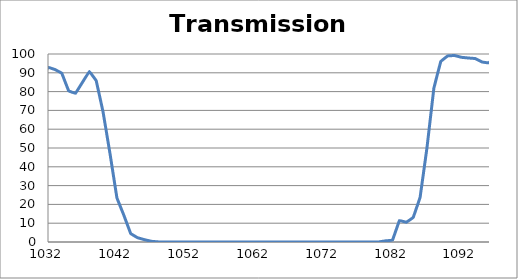
| Category | Transmission (%) |
|---|---|
| 2600.0 | 64.819 |
| 2599.0 | 65.186 |
| 2598.0 | 65.555 |
| 2597.0 | 65.883 |
| 2596.0 | 66.162 |
| 2595.0 | 66.42 |
| 2594.0 | 66.678 |
| 2593.0 | 66.877 |
| 2592.0 | 67.095 |
| 2591.0 | 67.325 |
| 2590.0 | 67.552 |
| 2589.0 | 67.796 |
| 2588.0 | 67.999 |
| 2587.0 | 68.162 |
| 2586.0 | 68.317 |
| 2585.0 | 68.507 |
| 2584.0 | 68.664 |
| 2583.0 | 68.918 |
| 2582.0 | 69.226 |
| 2581.0 | 69.512 |
| 2580.0 | 69.807 |
| 2579.0 | 70.151 |
| 2578.0 | 70.512 |
| 2577.0 | 70.845 |
| 2576.0 | 71.184 |
| 2575.0 | 71.542 |
| 2574.0 | 71.93 |
| 2573.0 | 72.319 |
| 2572.0 | 72.675 |
| 2571.0 | 73.022 |
| 2570.0 | 73.314 |
| 2569.0 | 73.608 |
| 2568.0 | 73.897 |
| 2567.0 | 74.14 |
| 2566.0 | 74.362 |
| 2565.0 | 74.49 |
| 2564.0 | 74.566 |
| 2563.0 | 74.628 |
| 2562.0 | 74.693 |
| 2561.0 | 74.696 |
| 2560.0 | 74.703 |
| 2559.0 | 74.685 |
| 2558.0 | 74.643 |
| 2557.0 | 74.584 |
| 2556.0 | 74.556 |
| 2555.0 | 74.48 |
| 2554.0 | 74.427 |
| 2553.0 | 74.418 |
| 2552.0 | 74.424 |
| 2551.0 | 74.475 |
| 2550.0 | 74.578 |
| 2549.0 | 74.709 |
| 2548.0 | 74.891 |
| 2547.0 | 75.08 |
| 2546.0 | 75.272 |
| 2545.0 | 75.492 |
| 2544.0 | 75.713 |
| 2543.0 | 75.906 |
| 2542.0 | 76.072 |
| 2541.0 | 76.221 |
| 2540.0 | 76.339 |
| 2539.0 | 76.352 |
| 2538.0 | 76.293 |
| 2537.0 | 76.152 |
| 2536.0 | 76.034 |
| 2535.0 | 75.842 |
| 2534.0 | 75.558 |
| 2533.0 | 75.249 |
| 2532.0 | 74.847 |
| 2531.0 | 74.474 |
| 2530.0 | 73.999 |
| 2529.0 | 73.49 |
| 2528.0 | 73.081 |
| 2527.0 | 72.629 |
| 2526.0 | 72.203 |
| 2525.0 | 71.814 |
| 2524.0 | 71.435 |
| 2523.0 | 71.111 |
| 2522.0 | 70.844 |
| 2521.0 | 70.589 |
| 2520.0 | 70.412 |
| 2519.0 | 70.319 |
| 2518.0 | 70.301 |
| 2517.0 | 70.356 |
| 2516.0 | 70.497 |
| 2515.0 | 70.667 |
| 2514.0 | 70.884 |
| 2513.0 | 71.127 |
| 2512.0 | 71.414 |
| 2511.0 | 71.707 |
| 2510.0 | 72.014 |
| 2509.0 | 72.284 |
| 2508.0 | 72.513 |
| 2507.0 | 72.692 |
| 2506.0 | 72.827 |
| 2505.0 | 72.874 |
| 2504.0 | 72.84 |
| 2503.0 | 72.759 |
| 2502.0 | 72.569 |
| 2501.0 | 72.298 |
| 2500.0 | 71.968 |
| 2499.0 | 71.635 |
| 2498.0 | 71.267 |
| 2497.0 | 70.84 |
| 2496.0 | 70.388 |
| 2495.0 | 69.922 |
| 2494.0 | 69.465 |
| 2493.0 | 69.022 |
| 2492.0 | 68.689 |
| 2491.0 | 68.455 |
| 2490.0 | 68.243 |
| 2489.0 | 68.086 |
| 2488.0 | 68.006 |
| 2487.0 | 68.022 |
| 2486.0 | 68.131 |
| 2485.0 | 68.337 |
| 2484.0 | 68.64 |
| 2483.0 | 69.028 |
| 2482.0 | 69.51 |
| 2481.0 | 70.027 |
| 2480.0 | 70.605 |
| 2479.0 | 71.265 |
| 2478.0 | 71.965 |
| 2477.0 | 72.663 |
| 2476.0 | 73.4 |
| 2475.0 | 74.11 |
| 2474.0 | 74.782 |
| 2473.0 | 75.445 |
| 2472.0 | 76.085 |
| 2471.0 | 76.671 |
| 2470.0 | 77.203 |
| 2469.0 | 77.634 |
| 2468.0 | 78 |
| 2467.0 | 78.272 |
| 2466.0 | 78.493 |
| 2465.0 | 78.647 |
| 2464.0 | 78.76 |
| 2463.0 | 78.844 |
| 2462.0 | 78.886 |
| 2461.0 | 78.891 |
| 2460.0 | 78.882 |
| 2459.0 | 78.859 |
| 2458.0 | 78.831 |
| 2457.0 | 78.801 |
| 2456.0 | 78.793 |
| 2455.0 | 78.766 |
| 2454.0 | 78.74 |
| 2453.0 | 78.744 |
| 2452.0 | 78.744 |
| 2451.0 | 78.732 |
| 2450.0 | 78.716 |
| 2449.0 | 78.675 |
| 2448.0 | 78.624 |
| 2447.0 | 78.556 |
| 2446.0 | 78.48 |
| 2445.0 | 78.41 |
| 2444.0 | 78.32 |
| 2443.0 | 78.2 |
| 2442.0 | 78.053 |
| 2441.0 | 77.915 |
| 2440.0 | 77.762 |
| 2439.0 | 77.594 |
| 2438.0 | 77.428 |
| 2437.0 | 77.289 |
| 2436.0 | 77.171 |
| 2435.0 | 77.075 |
| 2434.0 | 77.006 |
| 2433.0 | 76.975 |
| 2432.0 | 76.984 |
| 2431.0 | 77.02 |
| 2430.0 | 77.064 |
| 2429.0 | 77.133 |
| 2428.0 | 77.218 |
| 2427.0 | 77.297 |
| 2426.0 | 77.363 |
| 2425.0 | 77.401 |
| 2424.0 | 77.411 |
| 2423.0 | 77.366 |
| 2422.0 | 77.258 |
| 2421.0 | 77.071 |
| 2420.0 | 76.832 |
| 2419.0 | 76.56 |
| 2418.0 | 76.213 |
| 2417.0 | 75.783 |
| 2416.0 | 75.285 |
| 2415.0 | 74.745 |
| 2414.0 | 74.163 |
| 2413.0 | 73.575 |
| 2412.0 | 72.996 |
| 2411.0 | 72.394 |
| 2410.0 | 71.804 |
| 2409.0 | 71.261 |
| 2408.0 | 70.718 |
| 2407.0 | 70.236 |
| 2406.0 | 69.838 |
| 2405.0 | 69.51 |
| 2404.0 | 69.263 |
| 2403.0 | 69.066 |
| 2402.0 | 68.926 |
| 2401.0 | 68.846 |
| 2400.0 | 68.843 |
| 2399.0 | 68.908 |
| 2398.0 | 69.013 |
| 2397.0 | 69.109 |
| 2396.0 | 69.181 |
| 2395.0 | 69.226 |
| 2394.0 | 69.222 |
| 2393.0 | 69.159 |
| 2392.0 | 69.048 |
| 2391.0 | 68.865 |
| 2390.0 | 68.61 |
| 2389.0 | 68.271 |
| 2388.0 | 67.83 |
| 2387.0 | 67.295 |
| 2386.0 | 66.698 |
| 2385.0 | 66.06 |
| 2384.0 | 65.41 |
| 2383.0 | 64.742 |
| 2382.0 | 64.098 |
| 2381.0 | 63.474 |
| 2380.0 | 62.869 |
| 2379.0 | 62.323 |
| 2378.0 | 61.845 |
| 2377.0 | 61.447 |
| 2376.0 | 61.135 |
| 2375.0 | 60.935 |
| 2374.0 | 60.836 |
| 2373.0 | 60.809 |
| 2372.0 | 60.877 |
| 2371.0 | 61.003 |
| 2370.0 | 61.18 |
| 2369.0 | 61.409 |
| 2368.0 | 61.676 |
| 2367.0 | 61.979 |
| 2366.0 | 62.3 |
| 2365.0 | 62.607 |
| 2364.0 | 62.866 |
| 2363.0 | 63.094 |
| 2362.0 | 63.284 |
| 2361.0 | 63.412 |
| 2360.0 | 63.46 |
| 2359.0 | 63.458 |
| 2358.0 | 63.441 |
| 2357.0 | 63.353 |
| 2356.0 | 63.185 |
| 2355.0 | 63.002 |
| 2354.0 | 62.808 |
| 2353.0 | 62.629 |
| 2352.0 | 62.469 |
| 2351.0 | 62.379 |
| 2350.0 | 62.343 |
| 2349.0 | 62.348 |
| 2348.0 | 62.431 |
| 2347.0 | 62.603 |
| 2346.0 | 62.853 |
| 2345.0 | 63.189 |
| 2344.0 | 63.595 |
| 2343.0 | 64.076 |
| 2342.0 | 64.563 |
| 2341.0 | 65.063 |
| 2340.0 | 65.568 |
| 2339.0 | 66.084 |
| 2338.0 | 66.57 |
| 2337.0 | 66.985 |
| 2336.0 | 67.332 |
| 2335.0 | 67.628 |
| 2334.0 | 67.853 |
| 2333.0 | 67.961 |
| 2332.0 | 68.007 |
| 2331.0 | 67.968 |
| 2330.0 | 67.865 |
| 2329.0 | 67.721 |
| 2328.0 | 67.581 |
| 2327.0 | 67.446 |
| 2326.0 | 67.298 |
| 2325.0 | 67.173 |
| 2324.0 | 67.088 |
| 2323.0 | 67.092 |
| 2322.0 | 67.159 |
| 2321.0 | 67.3 |
| 2320.0 | 67.536 |
| 2319.0 | 67.848 |
| 2318.0 | 68.179 |
| 2317.0 | 68.553 |
| 2316.0 | 68.92 |
| 2315.0 | 69.244 |
| 2314.0 | 69.511 |
| 2313.0 | 69.662 |
| 2312.0 | 69.697 |
| 2311.0 | 69.585 |
| 2310.0 | 69.311 |
| 2309.0 | 68.827 |
| 2308.0 | 68.141 |
| 2307.0 | 67.315 |
| 2306.0 | 66.362 |
| 2305.0 | 65.279 |
| 2304.0 | 64.202 |
| 2303.0 | 63.066 |
| 2302.0 | 61.9 |
| 2301.0 | 60.809 |
| 2300.0 | 59.82 |
| 2299.0 | 58.946 |
| 2298.0 | 58.244 |
| 2297.0 | 57.702 |
| 2296.0 | 57.354 |
| 2295.0 | 57.173 |
| 2294.0 | 57.153 |
| 2293.0 | 57.285 |
| 2292.0 | 57.59 |
| 2291.0 | 58.022 |
| 2290.0 | 58.569 |
| 2289.0 | 59.193 |
| 2288.0 | 59.879 |
| 2287.0 | 60.48 |
| 2286.0 | 60.995 |
| 2285.0 | 61.429 |
| 2284.0 | 61.678 |
| 2283.0 | 61.697 |
| 2282.0 | 61.487 |
| 2281.0 | 61.019 |
| 2280.0 | 60.273 |
| 2279.0 | 59.287 |
| 2278.0 | 58.157 |
| 2277.0 | 56.857 |
| 2276.0 | 55.406 |
| 2275.0 | 53.91 |
| 2274.0 | 52.397 |
| 2273.0 | 50.979 |
| 2272.0 | 49.644 |
| 2271.0 | 48.457 |
| 2270.0 | 47.463 |
| 2269.0 | 46.634 |
| 2268.0 | 45.977 |
| 2267.0 | 45.558 |
| 2266.0 | 45.298 |
| 2265.0 | 45.23 |
| 2264.0 | 45.32 |
| 2263.0 | 45.573 |
| 2262.0 | 45.948 |
| 2261.0 | 46.405 |
| 2260.0 | 46.931 |
| 2259.0 | 47.506 |
| 2258.0 | 48.061 |
| 2257.0 | 48.597 |
| 2256.0 | 49.051 |
| 2255.0 | 49.42 |
| 2254.0 | 49.707 |
| 2253.0 | 49.852 |
| 2252.0 | 49.83 |
| 2251.0 | 49.704 |
| 2250.0 | 49.469 |
| 2249.0 | 49.146 |
| 2248.0 | 48.754 |
| 2247.0 | 48.34 |
| 2246.0 | 47.924 |
| 2245.0 | 47.582 |
| 2244.0 | 47.323 |
| 2243.0 | 47.099 |
| 2242.0 | 46.997 |
| 2241.0 | 47.035 |
| 2240.0 | 47.222 |
| 2239.0 | 47.569 |
| 2238.0 | 48.023 |
| 2237.0 | 48.679 |
| 2236.0 | 49.476 |
| 2235.0 | 50.312 |
| 2234.0 | 51.22 |
| 2233.0 | 52.176 |
| 2232.0 | 53.073 |
| 2231.0 | 54.026 |
| 2230.0 | 54.828 |
| 2229.0 | 55.519 |
| 2228.0 | 56.086 |
| 2227.0 | 56.477 |
| 2226.0 | 56.724 |
| 2225.0 | 56.844 |
| 2224.0 | 56.798 |
| 2223.0 | 56.605 |
| 2222.0 | 56.346 |
| 2221.0 | 56.024 |
| 2220.0 | 55.695 |
| 2219.0 | 55.371 |
| 2218.0 | 55.112 |
| 2217.0 | 54.858 |
| 2216.0 | 54.754 |
| 2215.0 | 54.658 |
| 2214.0 | 54.632 |
| 2213.0 | 54.667 |
| 2212.0 | 54.758 |
| 2211.0 | 54.882 |
| 2210.0 | 55.009 |
| 2209.0 | 55.094 |
| 2208.0 | 55.105 |
| 2207.0 | 55.017 |
| 2206.0 | 54.839 |
| 2205.0 | 54.577 |
| 2204.0 | 54.155 |
| 2203.0 | 53.618 |
| 2202.0 | 53.015 |
| 2201.0 | 52.262 |
| 2200.0 | 51.461 |
| 2199.0 | 50.591 |
| 2198.0 | 49.739 |
| 2197.0 | 48.84 |
| 2196.0 | 48.033 |
| 2195.0 | 47.205 |
| 2194.0 | 46.493 |
| 2193.0 | 45.817 |
| 2192.0 | 45.204 |
| 2191.0 | 44.623 |
| 2190.0 | 44.103 |
| 2189.0 | 43.623 |
| 2188.0 | 43.174 |
| 2187.0 | 42.755 |
| 2186.0 | 42.382 |
| 2185.0 | 42.061 |
| 2184.0 | 41.732 |
| 2183.0 | 41.391 |
| 2182.0 | 41.083 |
| 2181.0 | 40.806 |
| 2180.0 | 40.563 |
| 2179.0 | 40.363 |
| 2178.0 | 40.196 |
| 2177.0 | 40.067 |
| 2176.0 | 40.04 |
| 2175.0 | 40.05 |
| 2174.0 | 40.118 |
| 2173.0 | 40.238 |
| 2172.0 | 40.445 |
| 2171.0 | 40.729 |
| 2170.0 | 41.052 |
| 2169.0 | 41.364 |
| 2168.0 | 41.678 |
| 2167.0 | 41.944 |
| 2166.0 | 42.181 |
| 2165.0 | 42.373 |
| 2164.0 | 42.398 |
| 2163.0 | 42.271 |
| 2162.0 | 41.985 |
| 2161.0 | 41.537 |
| 2160.0 | 40.943 |
| 2159.0 | 40.245 |
| 2158.0 | 39.477 |
| 2157.0 | 38.59 |
| 2156.0 | 37.696 |
| 2155.0 | 36.844 |
| 2154.0 | 36.078 |
| 2153.0 | 35.374 |
| 2152.0 | 34.837 |
| 2151.0 | 34.429 |
| 2150.0 | 34.226 |
| 2149.0 | 34.2 |
| 2148.0 | 34.363 |
| 2147.0 | 34.743 |
| 2146.0 | 35.36 |
| 2145.0 | 36.143 |
| 2144.0 | 37.094 |
| 2143.0 | 38.211 |
| 2142.0 | 39.443 |
| 2141.0 | 40.74 |
| 2140.0 | 42.123 |
| 2139.0 | 43.321 |
| 2138.0 | 44.391 |
| 2137.0 | 45.266 |
| 2136.0 | 45.914 |
| 2135.0 | 46.28 |
| 2134.0 | 46.306 |
| 2133.0 | 46.081 |
| 2132.0 | 45.608 |
| 2131.0 | 44.975 |
| 2130.0 | 44.256 |
| 2129.0 | 43.469 |
| 2128.0 | 42.725 |
| 2127.0 | 42.079 |
| 2126.0 | 41.594 |
| 2125.0 | 41.308 |
| 2124.0 | 41.211 |
| 2123.0 | 41.386 |
| 2122.0 | 41.839 |
| 2121.0 | 42.53 |
| 2120.0 | 43.474 |
| 2119.0 | 44.659 |
| 2118.0 | 46.052 |
| 2117.0 | 47.633 |
| 2116.0 | 49.203 |
| 2115.0 | 50.813 |
| 2114.0 | 52.321 |
| 2113.0 | 53.642 |
| 2112.0 | 54.704 |
| 2111.0 | 55.366 |
| 2110.0 | 55.663 |
| 2109.0 | 55.633 |
| 2108.0 | 55.317 |
| 2107.0 | 54.817 |
| 2106.0 | 54.199 |
| 2105.0 | 53.516 |
| 2104.0 | 52.905 |
| 2103.0 | 52.424 |
| 2102.0 | 52.135 |
| 2101.0 | 52.025 |
| 2100.0 | 52.146 |
| 2099.0 | 52.506 |
| 2098.0 | 53.049 |
| 2097.0 | 53.71 |
| 2096.0 | 54.446 |
| 2095.0 | 55.178 |
| 2094.0 | 55.862 |
| 2093.0 | 56.403 |
| 2092.0 | 56.687 |
| 2091.0 | 56.698 |
| 2090.0 | 56.391 |
| 2089.0 | 55.823 |
| 2088.0 | 54.984 |
| 2087.0 | 53.927 |
| 2086.0 | 52.704 |
| 2085.0 | 51.425 |
| 2084.0 | 50.184 |
| 2083.0 | 49.05 |
| 2082.0 | 48.121 |
| 2081.0 | 47.385 |
| 2080.0 | 46.882 |
| 2079.0 | 46.67 |
| 2078.0 | 46.727 |
| 2077.0 | 46.991 |
| 2076.0 | 47.467 |
| 2075.0 | 48.101 |
| 2074.0 | 48.814 |
| 2073.0 | 49.532 |
| 2072.0 | 50.151 |
| 2071.0 | 50.529 |
| 2070.0 | 50.618 |
| 2069.0 | 50.373 |
| 2068.0 | 49.785 |
| 2067.0 | 48.915 |
| 2066.0 | 47.788 |
| 2065.0 | 46.452 |
| 2064.0 | 45.064 |
| 2063.0 | 43.687 |
| 2062.0 | 42.407 |
| 2061.0 | 41.323 |
| 2060.0 | 40.404 |
| 2059.0 | 39.714 |
| 2058.0 | 39.309 |
| 2057.0 | 39.164 |
| 2056.0 | 39.233 |
| 2055.0 | 39.529 |
| 2054.0 | 40.042 |
| 2053.0 | 40.74 |
| 2052.0 | 41.546 |
| 2051.0 | 42.396 |
| 2050.0 | 43.26 |
| 2049.0 | 44.075 |
| 2048.0 | 44.756 |
| 2047.0 | 45.183 |
| 2046.0 | 45.373 |
| 2045.0 | 45.317 |
| 2044.0 | 45.044 |
| 2043.0 | 44.602 |
| 2042.0 | 44.056 |
| 2041.0 | 43.457 |
| 2040.0 | 42.877 |
| 2039.0 | 42.407 |
| 2038.0 | 42.134 |
| 2037.0 | 42.07 |
| 2036.0 | 42.229 |
| 2035.0 | 42.654 |
| 2034.0 | 43.407 |
| 2033.0 | 44.365 |
| 2032.0 | 45.485 |
| 2031.0 | 46.776 |
| 2030.0 | 48.163 |
| 2029.0 | 49.521 |
| 2028.0 | 50.666 |
| 2027.0 | 51.564 |
| 2026.0 | 52.142 |
| 2025.0 | 52.378 |
| 2024.0 | 52.232 |
| 2023.0 | 51.72 |
| 2022.0 | 50.959 |
| 2021.0 | 50.064 |
| 2020.0 | 49.136 |
| 2019.0 | 48.27 |
| 2018.0 | 47.51 |
| 2017.0 | 46.925 |
| 2016.0 | 46.591 |
| 2015.0 | 46.493 |
| 2014.0 | 46.585 |
| 2013.0 | 46.872 |
| 2012.0 | 47.363 |
| 2011.0 | 47.936 |
| 2010.0 | 48.498 |
| 2009.0 | 49.026 |
| 2008.0 | 49.409 |
| 2007.0 | 49.563 |
| 2006.0 | 49.472 |
| 2005.0 | 49.11 |
| 2004.0 | 48.437 |
| 2003.0 | 47.496 |
| 2002.0 | 46.39 |
| 2001.0 | 45.203 |
| 2000.0 | 44.028 |
| 1999.0 | 42.994 |
| 1998.0 | 42.089 |
| 1997.0 | 41.349 |
| 1996.0 | 40.872 |
| 1995.0 | 40.657 |
| 1994.0 | 40.677 |
| 1993.0 | 40.871 |
| 1992.0 | 41.212 |
| 1991.0 | 41.647 |
| 1990.0 | 42.101 |
| 1989.0 | 42.507 |
| 1988.0 | 42.748 |
| 1987.0 | 42.785 |
| 1986.0 | 42.569 |
| 1985.0 | 42.089 |
| 1984.0 | 41.373 |
| 1983.0 | 40.477 |
| 1982.0 | 39.48 |
| 1981.0 | 38.451 |
| 1980.0 | 37.474 |
| 1979.0 | 36.602 |
| 1978.0 | 35.887 |
| 1977.0 | 35.356 |
| 1976.0 | 35.031 |
| 1975.0 | 34.907 |
| 1974.0 | 34.984 |
| 1973.0 | 35.251 |
| 1972.0 | 35.692 |
| 1971.0 | 36.23 |
| 1970.0 | 36.853 |
| 1969.0 | 37.543 |
| 1968.0 | 38.186 |
| 1967.0 | 38.691 |
| 1966.0 | 39.081 |
| 1965.0 | 39.305 |
| 1964.0 | 39.312 |
| 1963.0 | 39.128 |
| 1962.0 | 38.839 |
| 1961.0 | 38.483 |
| 1960.0 | 38.096 |
| 1959.0 | 37.761 |
| 1958.0 | 37.494 |
| 1957.0 | 37.352 |
| 1956.0 | 37.388 |
| 1955.0 | 37.641 |
| 1954.0 | 38.116 |
| 1953.0 | 38.765 |
| 1952.0 | 39.555 |
| 1951.0 | 40.463 |
| 1950.0 | 41.405 |
| 1949.0 | 42.395 |
| 1948.0 | 43.29 |
| 1947.0 | 44.03 |
| 1946.0 | 44.625 |
| 1945.0 | 45.104 |
| 1944.0 | 45.387 |
| 1943.0 | 45.541 |
| 1942.0 | 45.632 |
| 1941.0 | 45.685 |
| 1940.0 | 45.746 |
| 1939.0 | 45.855 |
| 1938.0 | 46.1 |
| 1937.0 | 46.467 |
| 1936.0 | 46.965 |
| 1935.0 | 47.565 |
| 1934.0 | 48.212 |
| 1933.0 | 48.843 |
| 1932.0 | 49.426 |
| 1931.0 | 49.893 |
| 1930.0 | 50.146 |
| 1929.0 | 50.15 |
| 1928.0 | 50.006 |
| 1927.0 | 49.693 |
| 1926.0 | 49.246 |
| 1925.0 | 48.76 |
| 1924.0 | 48.316 |
| 1923.0 | 47.929 |
| 1922.0 | 47.622 |
| 1921.0 | 47.496 |
| 1920.0 | 47.574 |
| 1919.0 | 47.83 |
| 1918.0 | 48.297 |
| 1917.0 | 48.886 |
| 1916.0 | 49.488 |
| 1915.0 | 49.95 |
| 1914.0 | 50.134 |
| 1913.0 | 49.932 |
| 1912.0 | 49.351 |
| 1911.0 | 48.535 |
| 1910.0 | 47.563 |
| 1909.0 | 46.385 |
| 1908.0 | 44.963 |
| 1907.0 | 43.269 |
| 1906.0 | 41.473 |
| 1905.0 | 40.005 |
| 1904.0 | 38.984 |
| 1903.0 | 38.363 |
| 1902.0 | 38.103 |
| 1901.0 | 38.058 |
| 1900.0 | 38.253 |
| 1899.0 | 38.566 |
| 1898.0 | 38.936 |
| 1897.0 | 39.393 |
| 1896.0 | 39.751 |
| 1895.0 | 39.902 |
| 1894.0 | 39.718 |
| 1893.0 | 39.113 |
| 1892.0 | 37.954 |
| 1891.0 | 36.584 |
| 1890.0 | 35.138 |
| 1889.0 | 33.636 |
| 1888.0 | 32.341 |
| 1887.0 | 31.189 |
| 1886.0 | 30.175 |
| 1885.0 | 29.281 |
| 1884.0 | 28.68 |
| 1883.0 | 28.493 |
| 1882.0 | 28.692 |
| 1881.0 | 29.311 |
| 1880.0 | 30.289 |
| 1879.0 | 31.529 |
| 1878.0 | 33.203 |
| 1877.0 | 34.893 |
| 1876.0 | 36.587 |
| 1875.0 | 38.166 |
| 1874.0 | 39.424 |
| 1873.0 | 40.089 |
| 1872.0 | 40.334 |
| 1871.0 | 40.049 |
| 1870.0 | 39.191 |
| 1869.0 | 38.099 |
| 1868.0 | 36.932 |
| 1867.0 | 35.939 |
| 1866.0 | 35.167 |
| 1865.0 | 34.691 |
| 1864.0 | 34.477 |
| 1863.0 | 34.582 |
| 1862.0 | 35.106 |
| 1861.0 | 35.957 |
| 1860.0 | 37.185 |
| 1859.0 | 38.779 |
| 1858.0 | 40.508 |
| 1857.0 | 42.438 |
| 1856.0 | 44.419 |
| 1855.0 | 46.245 |
| 1854.0 | 47.848 |
| 1853.0 | 48.962 |
| 1852.0 | 49.752 |
| 1851.0 | 50.12 |
| 1850.0 | 50.13 |
| 1849.0 | 49.779 |
| 1848.0 | 49.006 |
| 1847.0 | 48.173 |
| 1846.0 | 47.657 |
| 1845.0 | 47.439 |
| 1844.0 | 47.491 |
| 1843.0 | 47.726 |
| 1842.0 | 48.037 |
| 1841.0 | 48.227 |
| 1840.0 | 48.658 |
| 1839.0 | 49.287 |
| 1838.0 | 50.05 |
| 1837.0 | 50.916 |
| 1836.0 | 51.724 |
| 1835.0 | 52.469 |
| 1834.0 | 53.185 |
| 1833.0 | 53.835 |
| 1832.0 | 54.443 |
| 1831.0 | 54.73 |
| 1830.0 | 54.792 |
| 1829.0 | 54.52 |
| 1828.0 | 53.93 |
| 1827.0 | 52.884 |
| 1826.0 | 51.468 |
| 1825.0 | 50.067 |
| 1824.0 | 48.608 |
| 1823.0 | 47.092 |
| 1822.0 | 45.327 |
| 1821.0 | 43.524 |
| 1820.0 | 42.103 |
| 1819.0 | 41.336 |
| 1818.0 | 41.1 |
| 1817.0 | 41.306 |
| 1816.0 | 41.89 |
| 1815.0 | 42.831 |
| 1814.0 | 44.053 |
| 1813.0 | 45.535 |
| 1812.0 | 47.145 |
| 1811.0 | 48.531 |
| 1810.0 | 49.499 |
| 1809.0 | 49.767 |
| 1808.0 | 49.209 |
| 1807.0 | 47.814 |
| 1806.0 | 45.675 |
| 1805.0 | 43.204 |
| 1804.0 | 40.66 |
| 1803.0 | 38.307 |
| 1802.0 | 36.269 |
| 1801.0 | 34.816 |
| 1800.0 | 33.836 |
| 1799.0 | 33.52 |
| 1798.0 | 33.877 |
| 1797.0 | 34.934 |
| 1796.0 | 36.567 |
| 1795.0 | 38.819 |
| 1794.0 | 41.548 |
| 1793.0 | 44.456 |
| 1792.0 | 47.331 |
| 1791.0 | 49.507 |
| 1790.0 | 50.735 |
| 1789.0 | 50.776 |
| 1788.0 | 49.69 |
| 1787.0 | 47.856 |
| 1786.0 | 45.599 |
| 1785.0 | 43.425 |
| 1784.0 | 41.451 |
| 1783.0 | 40.26 |
| 1782.0 | 39.671 |
| 1781.0 | 39.803 |
| 1780.0 | 40.695 |
| 1779.0 | 42.294 |
| 1778.0 | 44.582 |
| 1777.0 | 47.245 |
| 1776.0 | 50.251 |
| 1775.0 | 53.277 |
| 1774.0 | 55.905 |
| 1773.0 | 57.732 |
| 1772.0 | 58.665 |
| 1771.0 | 58.635 |
| 1770.0 | 57.812 |
| 1769.0 | 56.5 |
| 1768.0 | 55.094 |
| 1767.0 | 53.926 |
| 1766.0 | 53.19 |
| 1765.0 | 53.126 |
| 1764.0 | 53.752 |
| 1763.0 | 55.022 |
| 1762.0 | 56.646 |
| 1761.0 | 58.359 |
| 1760.0 | 59.76 |
| 1759.0 | 60.243 |
| 1758.0 | 59.661 |
| 1757.0 | 57.939 |
| 1756.0 | 55.247 |
| 1755.0 | 51.901 |
| 1754.0 | 48.527 |
| 1753.0 | 45.48 |
| 1752.0 | 42.989 |
| 1751.0 | 41.334 |
| 1750.0 | 40.457 |
| 1749.0 | 40.456 |
| 1748.0 | 41.299 |
| 1747.0 | 42.898 |
| 1746.0 | 45.196 |
| 1745.0 | 47.865 |
| 1744.0 | 50.707 |
| 1743.0 | 53.093 |
| 1742.0 | 54.603 |
| 1741.0 | 54.92 |
| 1740.0 | 53.906 |
| 1739.0 | 51.846 |
| 1738.0 | 49.146 |
| 1737.0 | 46.256 |
| 1736.0 | 43.597 |
| 1735.0 | 41.374 |
| 1734.0 | 39.776 |
| 1733.0 | 38.879 |
| 1732.0 | 38.735 |
| 1731.0 | 39.246 |
| 1730.0 | 40.45 |
| 1729.0 | 42.324 |
| 1728.0 | 44.744 |
| 1727.0 | 47.553 |
| 1726.0 | 50.552 |
| 1725.0 | 53.349 |
| 1724.0 | 55.795 |
| 1723.0 | 57.589 |
| 1722.0 | 58.642 |
| 1721.0 | 58.979 |
| 1720.0 | 58.822 |
| 1719.0 | 58.416 |
| 1718.0 | 58.012 |
| 1717.0 | 57.847 |
| 1716.0 | 58.057 |
| 1715.0 | 58.675 |
| 1714.0 | 59.641 |
| 1713.0 | 60.842 |
| 1712.0 | 62.212 |
| 1711.0 | 63.533 |
| 1710.0 | 64.732 |
| 1709.0 | 65.697 |
| 1708.0 | 66.364 |
| 1707.0 | 66.787 |
| 1706.0 | 67.034 |
| 1705.0 | 67.19 |
| 1704.0 | 67.288 |
| 1703.0 | 67.363 |
| 1702.0 | 67.352 |
| 1701.0 | 67.157 |
| 1700.0 | 66.676 |
| 1699.0 | 65.815 |
| 1698.0 | 64.532 |
| 1697.0 | 62.904 |
| 1696.0 | 61.011 |
| 1695.0 | 58.979 |
| 1694.0 | 57.02 |
| 1693.0 | 55.325 |
| 1692.0 | 54.104 |
| 1691.0 | 53.361 |
| 1690.0 | 53.21 |
| 1689.0 | 53.714 |
| 1688.0 | 54.869 |
| 1687.0 | 56.601 |
| 1686.0 | 58.764 |
| 1685.0 | 61.079 |
| 1684.0 | 63.252 |
| 1683.0 | 64.904 |
| 1682.0 | 65.752 |
| 1681.0 | 65.622 |
| 1680.0 | 64.488 |
| 1679.0 | 62.658 |
| 1678.0 | 60.437 |
| 1677.0 | 58.258 |
| 1676.0 | 56.422 |
| 1675.0 | 55.172 |
| 1674.0 | 54.641 |
| 1673.0 | 54.87 |
| 1672.0 | 55.824 |
| 1671.0 | 57.416 |
| 1670.0 | 59.56 |
| 1669.0 | 62.096 |
| 1668.0 | 64.651 |
| 1667.0 | 66.86 |
| 1666.0 | 68.645 |
| 1665.0 | 69.772 |
| 1664.0 | 70.255 |
| 1663.0 | 70.161 |
| 1662.0 | 69.71 |
| 1661.0 | 69.127 |
| 1660.0 | 68.588 |
| 1659.0 | 68.248 |
| 1658.0 | 68.18 |
| 1657.0 | 68.39 |
| 1656.0 | 68.867 |
| 1655.0 | 69.523 |
| 1654.0 | 70.218 |
| 1653.0 | 70.873 |
| 1652.0 | 71.442 |
| 1651.0 | 71.888 |
| 1650.0 | 72.17 |
| 1649.0 | 72.362 |
| 1648.0 | 72.523 |
| 1647.0 | 72.725 |
| 1646.0 | 72.997 |
| 1645.0 | 73.36 |
| 1644.0 | 73.81 |
| 1643.0 | 74.271 |
| 1642.0 | 74.674 |
| 1641.0 | 74.962 |
| 1640.0 | 75.057 |
| 1639.0 | 74.88 |
| 1638.0 | 74.434 |
| 1637.0 | 73.805 |
| 1636.0 | 73.121 |
| 1635.0 | 72.515 |
| 1634.0 | 72.112 |
| 1633.0 | 72.02 |
| 1632.0 | 72.267 |
| 1631.0 | 72.853 |
| 1630.0 | 73.747 |
| 1629.0 | 74.815 |
| 1628.0 | 75.915 |
| 1627.0 | 76.918 |
| 1626.0 | 77.627 |
| 1625.0 | 77.912 |
| 1624.0 | 77.773 |
| 1623.0 | 77.265 |
| 1622.0 | 76.468 |
| 1621.0 | 75.543 |
| 1620.0 | 74.665 |
| 1619.0 | 73.977 |
| 1618.0 | 73.602 |
| 1617.0 | 73.599 |
| 1616.0 | 73.97 |
| 1615.0 | 74.662 |
| 1614.0 | 75.574 |
| 1613.0 | 76.589 |
| 1612.0 | 77.545 |
| 1611.0 | 78.298 |
| 1610.0 | 78.752 |
| 1609.0 | 78.855 |
| 1608.0 | 78.589 |
| 1607.0 | 78.027 |
| 1606.0 | 77.361 |
| 1605.0 | 76.695 |
| 1604.0 | 76.161 |
| 1603.0 | 75.916 |
| 1602.0 | 75.999 |
| 1601.0 | 76.451 |
| 1600.0 | 77.177 |
| 1599.0 | 78.073 |
| 1598.0 | 78.974 |
| 1597.0 | 79.727 |
| 1596.0 | 80.215 |
| 1595.0 | 80.323 |
| 1594.0 | 80.089 |
| 1593.0 | 79.573 |
| 1592.0 | 78.95 |
| 1591.0 | 78.376 |
| 1590.0 | 78.014 |
| 1589.0 | 77.972 |
| 1588.0 | 78.274 |
| 1587.0 | 78.939 |
| 1586.0 | 79.829 |
| 1585.0 | 80.782 |
| 1584.0 | 81.675 |
| 1583.0 | 82.287 |
| 1582.0 | 82.594 |
| 1581.0 | 82.583 |
| 1580.0 | 82.3 |
| 1579.0 | 81.902 |
| 1578.0 | 81.494 |
| 1577.0 | 81.255 |
| 1576.0 | 81.306 |
| 1575.0 | 81.687 |
| 1574.0 | 82.337 |
| 1573.0 | 83.197 |
| 1572.0 | 84.076 |
| 1571.0 | 84.856 |
| 1570.0 | 85.384 |
| 1569.0 | 85.563 |
| 1568.0 | 85.403 |
| 1567.0 | 84.995 |
| 1566.0 | 84.463 |
| 1565.0 | 84.035 |
| 1564.0 | 83.842 |
| 1563.0 | 83.974 |
| 1562.0 | 84.493 |
| 1561.0 | 85.326 |
| 1560.0 | 86.297 |
| 1559.0 | 87.243 |
| 1558.0 | 87.917 |
| 1557.0 | 88.105 |
| 1556.0 | 87.859 |
| 1555.0 | 87.193 |
| 1554.0 | 86.351 |
| 1553.0 | 85.519 |
| 1552.0 | 84.967 |
| 1551.0 | 84.863 |
| 1550.0 | 85.262 |
| 1549.0 | 86.073 |
| 1548.0 | 87.131 |
| 1547.0 | 88.255 |
| 1546.0 | 89.178 |
| 1545.0 | 89.721 |
| 1544.0 | 89.777 |
| 1543.0 | 89.376 |
| 1542.0 | 88.686 |
| 1541.0 | 87.928 |
| 1540.0 | 87.356 |
| 1539.0 | 87.139 |
| 1538.0 | 87.33 |
| 1537.0 | 87.944 |
| 1536.0 | 88.812 |
| 1535.0 | 89.808 |
| 1534.0 | 90.693 |
| 1533.0 | 91.316 |
| 1532.0 | 91.576 |
| 1531.0 | 91.481 |
| 1530.0 | 91.177 |
| 1529.0 | 90.761 |
| 1528.0 | 90.433 |
| 1527.0 | 90.291 |
| 1526.0 | 90.433 |
| 1525.0 | 90.784 |
| 1524.0 | 91.237 |
| 1523.0 | 91.596 |
| 1522.0 | 91.708 |
| 1521.0 | 91.477 |
| 1520.0 | 90.925 |
| 1519.0 | 90.214 |
| 1518.0 | 89.534 |
| 1517.0 | 89.204 |
| 1516.0 | 89.29 |
| 1515.0 | 89.882 |
| 1514.0 | 90.876 |
| 1513.0 | 92.159 |
| 1512.0 | 93.238 |
| 1511.0 | 93.954 |
| 1510.0 | 94.096 |
| 1509.0 | 93.586 |
| 1508.0 | 92.688 |
| 1507.0 | 91.488 |
| 1506.0 | 90.572 |
| 1505.0 | 90.061 |
| 1504.0 | 90.181 |
| 1503.0 | 90.914 |
| 1502.0 | 92.063 |
| 1501.0 | 93.43 |
| 1500.0 | 94.586 |
| 1499.0 | 95.208 |
| 1498.0 | 95.15 |
| 1497.0 | 94.425 |
| 1496.0 | 93.294 |
| 1495.0 | 92.08 |
| 1494.0 | 91.157 |
| 1493.0 | 90.741 |
| 1492.0 | 90.919 |
| 1491.0 | 91.775 |
| 1490.0 | 93.037 |
| 1489.0 | 94.455 |
| 1488.0 | 95.607 |
| 1487.0 | 96.201 |
| 1486.0 | 96.099 |
| 1485.0 | 95.298 |
| 1484.0 | 94.168 |
| 1483.0 | 93.079 |
| 1482.0 | 92.356 |
| 1481.0 | 92.264 |
| 1480.0 | 92.871 |
| 1479.0 | 94.003 |
| 1478.0 | 95.347 |
| 1477.0 | 96.452 |
| 1476.0 | 96.941 |
| 1475.0 | 96.581 |
| 1474.0 | 95.384 |
| 1473.0 | 93.7 |
| 1472.0 | 92.016 |
| 1471.0 | 90.617 |
| 1470.0 | 89.948 |
| 1469.0 | 90.252 |
| 1468.0 | 91.319 |
| 1467.0 | 93.029 |
| 1466.0 | 94.785 |
| 1465.0 | 96.367 |
| 1464.0 | 97.382 |
| 1463.0 | 97.618 |
| 1462.0 | 97.151 |
| 1461.0 | 96.283 |
| 1460.0 | 95.25 |
| 1459.0 | 94.4 |
| 1458.0 | 93.904 |
| 1457.0 | 94.024 |
| 1456.0 | 94.503 |
| 1455.0 | 95.268 |
| 1454.0 | 96.127 |
| 1453.0 | 96.876 |
| 1452.0 | 97.448 |
| 1451.0 | 97.688 |
| 1450.0 | 97.733 |
| 1449.0 | 97.614 |
| 1448.0 | 97.44 |
| 1447.0 | 97.344 |
| 1446.0 | 97.455 |
| 1445.0 | 97.713 |
| 1444.0 | 98.06 |
| 1443.0 | 98.38 |
| 1442.0 | 98.684 |
| 1441.0 | 98.833 |
| 1440.0 | 98.827 |
| 1439.0 | 98.829 |
| 1438.0 | 98.711 |
| 1437.0 | 98.656 |
| 1436.0 | 98.632 |
| 1435.0 | 98.703 |
| 1434.0 | 98.786 |
| 1433.0 | 98.85 |
| 1432.0 | 98.876 |
| 1431.0 | 98.907 |
| 1430.0 | 98.878 |
| 1429.0 | 98.848 |
| 1428.0 | 98.847 |
| 1427.0 | 98.891 |
| 1426.0 | 98.914 |
| 1425.0 | 98.992 |
| 1424.0 | 99.025 |
| 1423.0 | 99.064 |
| 1422.0 | 99.061 |
| 1421.0 | 99.055 |
| 1420.0 | 99.03 |
| 1419.0 | 98.922 |
| 1418.0 | 98.927 |
| 1417.0 | 98.921 |
| 1416.0 | 98.894 |
| 1415.0 | 98.794 |
| 1414.0 | 98.723 |
| 1413.0 | 98.527 |
| 1412.0 | 98.446 |
| 1411.0 | 98.346 |
| 1410.0 | 98.263 |
| 1409.0 | 98.302 |
| 1408.0 | 98.313 |
| 1407.0 | 98.339 |
| 1406.0 | 98.356 |
| 1405.0 | 98.316 |
| 1404.0 | 98.303 |
| 1403.0 | 98.296 |
| 1402.0 | 98.135 |
| 1401.0 | 97.921 |
| 1400.0 | 95.159 |
| 1399.0 | 94.216 |
| 1398.0 | 99.574 |
| 1397.0 | 99.254 |
| 1396.0 | 97.972 |
| 1395.0 | 95.397 |
| 1394.0 | 95.071 |
| 1393.0 | 100 |
| 1392.0 | 97.748 |
| 1391.0 | 98.811 |
| 1390.0 | 93.768 |
| 1389.0 | 89.222 |
| 1388.0 | 87.731 |
| 1387.0 | 89.371 |
| 1386.0 | 93.649 |
| 1385.0 | 99.001 |
| 1384.0 | 99.832 |
| 1383.0 | 98.227 |
| 1382.0 | 93.32 |
| 1381.0 | 88.001 |
| 1380.0 | 93.11 |
| 1379.0 | 95.975 |
| 1378.0 | 97.266 |
| 1377.0 | 99.56 |
| 1376.0 | 99.748 |
| 1375.0 | 99.08 |
| 1374.0 | 96.814 |
| 1373.0 | 94.229 |
| 1372.0 | 91.379 |
| 1371.0 | 92.403 |
| 1370.0 | 94.017 |
| 1369.0 | 95.165 |
| 1368.0 | 98.76 |
| 1367.0 | 96.071 |
| 1366.0 | 97.812 |
| 1365.0 | 97.225 |
| 1364.0 | 98.336 |
| 1363.0 | 98.642 |
| 1362.0 | 96.951 |
| 1361.0 | 98.028 |
| 1360.0 | 93.231 |
| 1359.0 | 93.71 |
| 1358.0 | 97.167 |
| 1357.0 | 95.88 |
| 1356.0 | 96.651 |
| 1355.0 | 97.09 |
| 1354.0 | 94.153 |
| 1353.0 | 95.01 |
| 1352.0 | 98.959 |
| 1351.0 | 99.657 |
| 1350.0 | 99.433 |
| 1349.0 | 99.268 |
| 1348.0 | 99.23 |
| 1347.0 | 99.81 |
| 1346.0 | 99.337 |
| 1345.0 | 99.913 |
| 1344.0 | 98.405 |
| 1343.0 | 94.225 |
| 1342.0 | 99.861 |
| 1341.0 | 99.922 |
| 1340.0 | 99.441 |
| 1339.0 | 98.339 |
| 1338.0 | 99.432 |
| 1337.0 | 99.932 |
| 1336.0 | 93.889 |
| 1335.0 | 92.971 |
| 1334.0 | 92.466 |
| 1333.0 | 93.519 |
| 1332.0 | 99.857 |
| 1331.0 | 97.088 |
| 1330.0 | 96.669 |
| 1329.0 | 98.885 |
| 1328.0 | 97.809 |
| 1327.0 | 99.969 |
| 1326.0 | 99.427 |
| 1325.0 | 98.967 |
| 1324.0 | 99.681 |
| 1323.0 | 99.444 |
| 1322.0 | 99.422 |
| 1321.0 | 98.446 |
| 1320.0 | 99.739 |
| 1319.0 | 98.721 |
| 1318.0 | 96.679 |
| 1317.0 | 92.712 |
| 1316.0 | 91.606 |
| 1315.0 | 93.197 |
| 1314.0 | 96.323 |
| 1313.0 | 99.218 |
| 1312.0 | 98.254 |
| 1311.0 | 98.768 |
| 1310.0 | 99.866 |
| 1309.0 | 98.61 |
| 1308.0 | 94.473 |
| 1307.0 | 94.009 |
| 1306.0 | 99.639 |
| 1305.0 | 98.877 |
| 1304.0 | 99.477 |
| 1303.0 | 99.163 |
| 1302.0 | 99.458 |
| 1301.0 | 99.663 |
| 1300.0 | 99.69 |
| 1299.0 | 94.462 |
| 1298.0 | 92.619 |
| 1297.0 | 94.739 |
| 1296.0 | 99.14 |
| 1295.0 | 98.27 |
| 1294.0 | 98.41 |
| 1293.0 | 98.847 |
| 1292.0 | 98.871 |
| 1291.0 | 94.259 |
| 1290.0 | 94.874 |
| 1289.0 | 99.856 |
| 1288.0 | 97.594 |
| 1287.0 | 98.493 |
| 1286.0 | 99.797 |
| 1285.0 | 98.572 |
| 1284.0 | 99.385 |
| 1283.0 | 98.559 |
| 1282.0 | 97.757 |
| 1281.0 | 99.278 |
| 1280.0 | 96.598 |
| 1279.0 | 92.971 |
| 1278.0 | 93.589 |
| 1277.0 | 95.492 |
| 1276.0 | 99.504 |
| 1275.0 | 98.775 |
| 1274.0 | 98.93 |
| 1273.0 | 99.2 |
| 1272.0 | 97.867 |
| 1271.0 | 99.367 |
| 1270.0 | 99.129 |
| 1269.0 | 99.648 |
| 1268.0 | 97.946 |
| 1267.0 | 98.688 |
| 1266.0 | 96.84 |
| 1265.0 | 94.821 |
| 1264.0 | 98.619 |
| 1263.0 | 98.475 |
| 1262.0 | 99.845 |
| 1261.0 | 98.467 |
| 1260.0 | 98.654 |
| 1259.0 | 99.812 |
| 1258.0 | 99.563 |
| 1257.0 | 99.646 |
| 1256.0 | 99.578 |
| 1255.0 | 99.95 |
| 1254.0 | 98.495 |
| 1253.0 | 95.413 |
| 1252.0 | 90.684 |
| 1251.0 | 91.095 |
| 1250.0 | 95.778 |
| 1249.0 | 98.369 |
| 1248.0 | 98.102 |
| 1247.0 | 99.371 |
| 1246.0 | 99.904 |
| 1245.0 | 99.735 |
| 1244.0 | 99.935 |
| 1243.0 | 99.546 |
| 1242.0 | 97.774 |
| 1241.0 | 93.581 |
| 1240.0 | 92.426 |
| 1239.0 | 95.017 |
| 1238.0 | 99.779 |
| 1237.0 | 99.182 |
| 1236.0 | 98.64 |
| 1235.0 | 97.853 |
| 1234.0 | 98.043 |
| 1233.0 | 99.243 |
| 1232.0 | 98.481 |
| 1231.0 | 97.843 |
| 1230.0 | 98.194 |
| 1229.0 | 98.813 |
| 1228.0 | 96.912 |
| 1227.0 | 94.096 |
| 1226.0 | 96.587 |
| 1225.0 | 99.183 |
| 1224.0 | 98.749 |
| 1223.0 | 99.107 |
| 1222.0 | 98.26 |
| 1221.0 | 93.507 |
| 1220.0 | 91.636 |
| 1219.0 | 95.667 |
| 1218.0 | 99.887 |
| 1217.0 | 99.461 |
| 1216.0 | 98.955 |
| 1215.0 | 99.676 |
| 1214.0 | 99.985 |
| 1213.0 | 99.233 |
| 1212.0 | 99.763 |
| 1211.0 | 99.445 |
| 1210.0 | 96.89 |
| 1209.0 | 98.876 |
| 1208.0 | 95.73 |
| 1207.0 | 96.481 |
| 1206.0 | 97.453 |
| 1205.0 | 97.892 |
| 1204.0 | 93.383 |
| 1203.0 | 94.641 |
| 1202.0 | 98.844 |
| 1201.0 | 99.428 |
| 1200.0 | 98.678 |
| 1199.0 | 96.95 |
| 1198.0 | 93.302 |
| 1197.0 | 96.868 |
| 1196.0 | 99.415 |
| 1195.0 | 99.861 |
| 1194.0 | 99.806 |
| 1193.0 | 99.55 |
| 1192.0 | 99.393 |
| 1191.0 | 99.94 |
| 1190.0 | 97.047 |
| 1189.0 | 96.838 |
| 1188.0 | 99.001 |
| 1187.0 | 97.916 |
| 1186.0 | 96.467 |
| 1185.0 | 97.667 |
| 1184.0 | 98.322 |
| 1183.0 | 98.139 |
| 1182.0 | 97.104 |
| 1181.0 | 97.409 |
| 1180.0 | 98.953 |
| 1179.0 | 98.919 |
| 1178.0 | 98.522 |
| 1177.0 | 97.627 |
| 1176.0 | 94.164 |
| 1175.0 | 94.455 |
| 1174.0 | 95.985 |
| 1173.0 | 96.249 |
| 1172.0 | 98.163 |
| 1171.0 | 95.846 |
| 1170.0 | 93.31 |
| 1169.0 | 93.374 |
| 1168.0 | 94.334 |
| 1167.0 | 95.494 |
| 1166.0 | 95.941 |
| 1165.0 | 97.079 |
| 1164.0 | 95.856 |
| 1163.0 | 94.779 |
| 1162.0 | 96.146 |
| 1161.0 | 97.709 |
| 1160.0 | 98.966 |
| 1159.0 | 98.961 |
| 1158.0 | 96.522 |
| 1157.0 | 93.059 |
| 1156.0 | 95.482 |
| 1155.0 | 96.997 |
| 1154.0 | 98.268 |
| 1153.0 | 95.712 |
| 1152.0 | 94.455 |
| 1151.0 | 94.887 |
| 1150.0 | 95.558 |
| 1149.0 | 95.593 |
| 1148.0 | 95.263 |
| 1147.0 | 96.574 |
| 1146.0 | 98.188 |
| 1145.0 | 94.876 |
| 1144.0 | 95.439 |
| 1143.0 | 96.097 |
| 1142.0 | 96.021 |
| 1141.0 | 96.911 |
| 1140.0 | 92.752 |
| 1139.0 | 93.904 |
| 1138.0 | 95.367 |
| 1137.0 | 97.324 |
| 1136.0 | 98.061 |
| 1135.0 | 99.756 |
| 1134.0 | 97.532 |
| 1133.0 | 97.178 |
| 1132.0 | 97.62 |
| 1131.0 | 97.475 |
| 1130.0 | 95.505 |
| 1129.0 | 93.341 |
| 1128.0 | 99.749 |
| 1127.0 | 95.76 |
| 1126.0 | 94.144 |
| 1125.0 | 95.427 |
| 1124.0 | 97.821 |
| 1123.0 | 97.739 |
| 1122.0 | 97.683 |
| 1121.0 | 98.256 |
| 1120.0 | 98.181 |
| 1119.0 | 96.9 |
| 1118.0 | 96.058 |
| 1117.0 | 96.878 |
| 1116.0 | 97.17 |
| 1115.0 | 98.93 |
| 1114.0 | 99.766 |
| 1113.0 | 99.118 |
| 1112.0 | 97.985 |
| 1111.0 | 96.634 |
| 1110.0 | 96.76 |
| 1109.0 | 98.066 |
| 1108.0 | 96.259 |
| 1107.0 | 95.994 |
| 1106.0 | 95.062 |
| 1105.0 | 94.173 |
| 1104.0 | 93.986 |
| 1103.0 | 94.801 |
| 1102.0 | 97.209 |
| 1101.0 | 98.045 |
| 1100.0 | 99.153 |
| 1099.0 | 94.899 |
| 1098.0 | 92.868 |
| 1097.0 | 99.706 |
| 1096.0 | 95.238 |
| 1095.0 | 95.735 |
| 1094.0 | 97.59 |
| 1093.0 | 97.874 |
| 1092.0 | 98.241 |
| 1091.0 | 99.201 |
| 1090.0 | 98.977 |
| 1089.0 | 96.013 |
| 1088.0 | 81.838 |
| 1087.0 | 50.186 |
| 1086.0 | 23.766 |
| 1085.0 | 13.056 |
| 1084.0 | 10.488 |
| 1083.0 | 11.436 |
| 1082.0 | 0.984 |
| 1081.0 | 0.622 |
| 1080.0 | 0.041 |
| 1079.0 | 0.011 |
| 1078.0 | 0.002 |
| 1077.0 | 0 |
| 1076.0 | 0 |
| 1075.0 | 0 |
| 1074.0 | 0 |
| 1073.0 | 0 |
| 1072.0 | 0 |
| 1071.0 | 0 |
| 1070.0 | 0 |
| 1069.0 | 0 |
| 1068.0 | 0 |
| 1067.0 | 0 |
| 1066.0 | 0 |
| 1065.0 | 0 |
| 1064.0 | 0 |
| 1063.0 | 0 |
| 1062.0 | 0 |
| 1061.0 | 0 |
| 1060.0 | 0 |
| 1059.0 | 0 |
| 1058.0 | 0 |
| 1057.0 | 0 |
| 1056.0 | 0 |
| 1055.0 | 0 |
| 1054.0 | 0.001 |
| 1053.0 | 0.001 |
| 1052.0 | 0.003 |
| 1051.0 | 0.009 |
| 1050.0 | 0.023 |
| 1049.0 | 0.036 |
| 1048.0 | 0.066 |
| 1047.0 | 0.37 |
| 1046.0 | 1.235 |
| 1045.0 | 2.274 |
| 1044.0 | 4.482 |
| 1043.0 | 14.31 |
| 1042.0 | 23.491 |
| 1041.0 | 47.003 |
| 1040.0 | 69.017 |
| 1039.0 | 85.745 |
| 1038.0 | 90.757 |
| 1037.0 | 84.948 |
| 1036.0 | 79.108 |
| 1035.0 | 80.353 |
| 1034.0 | 89.8 |
| 1033.0 | 91.732 |
| 1032.0 | 92.967 |
| 1031.0 | 85.958 |
| 1030.0 | 91.375 |
| 1029.0 | 94.205 |
| 1028.0 | 96.625 |
| 1027.0 | 97.089 |
| 1026.0 | 97.072 |
| 1025.0 | 95.347 |
| 1024.0 | 96.031 |
| 1023.0 | 96.419 |
| 1022.0 | 96.791 |
| 1021.0 | 97.388 |
| 1020.0 | 96.455 |
| 1019.0 | 97.657 |
| 1018.0 | 97.904 |
| 1017.0 | 96.447 |
| 1016.0 | 98.47 |
| 1015.0 | 95.961 |
| 1014.0 | 98.258 |
| 1013.0 | 98.288 |
| 1012.0 | 96.42 |
| 1011.0 | 92.034 |
| 1010.0 | 98.283 |
| 1009.0 | 98.792 |
| 1008.0 | 99.233 |
| 1007.0 | 99.437 |
| 1006.0 | 99.732 |
| 1005.0 | 92.987 |
| 1004.0 | 98.244 |
| 1003.0 | 99.266 |
| 1002.0 | 99.452 |
| 1001.0 | 99.315 |
| 1000.0 | 99.171 |
| 999.0 | 96.007 |
| 998.0 | 98.96 |
| 997.0 | 99.656 |
| 996.0 | 98.259 |
| 995.0 | 94.401 |
| 994.0 | 98.925 |
| 993.0 | 98.602 |
| 992.0 | 98.649 |
| 991.0 | 99.863 |
| 990.0 | 94.913 |
| 989.0 | 96.501 |
| 988.0 | 99.241 |
| 987.0 | 99.119 |
| 986.0 | 98.812 |
| 985.0 | 94.153 |
| 984.0 | 98.367 |
| 983.0 | 99.315 |
| 982.0 | 99.295 |
| 981.0 | 94.975 |
| 980.0 | 99.973 |
| 979.0 | 98.324 |
| 978.0 | 99.483 |
| 977.0 | 94.512 |
| 976.0 | 96.915 |
| 975.0 | 99.325 |
| 974.0 | 95.619 |
| 973.0 | 98.399 |
| 972.0 | 99.792 |
| 971.0 | 98.259 |
| 970.0 | 92.964 |
| 969.0 | 97.686 |
| 968.0 | 99.127 |
| 967.0 | 99.562 |
| 966.0 | 99.62 |
| 965.0 | 99.402 |
| 964.0 | 94.179 |
| 963.0 | 94.697 |
| 962.0 | 98.006 |
| 961.0 | 94.261 |
| 960.0 | 99.572 |
| 959.0 | 93.586 |
| 958.0 | 94.085 |
| 957.0 | 99.212 |
| 956.0 | 94.593 |
| 955.0 | 99.732 |
| 954.0 | 94.621 |
| 953.0 | 98.868 |
| 952.0 | 99.165 |
| 951.0 | 95.993 |
| 950.0 | 99.593 |
| 949.0 | 95.952 |
| 948.0 | 99.023 |
| 947.0 | 92.03 |
| 946.0 | 91.837 |
| 945.0 | 98.785 |
| 944.0 | 99.304 |
| 943.0 | 98.786 |
| 942.0 | 99.814 |
| 941.0 | 98.237 |
| 940.0 | 94.669 |
| 939.0 | 98.577 |
| 938.0 | 99.893 |
| 937.0 | 99.249 |
| 936.0 | 96.463 |
| 935.0 | 99.633 |
| 934.0 | 98.491 |
| 933.0 | 97.365 |
| 932.0 | 93.992 |
| 931.0 | 94.249 |
| 930.0 | 99.773 |
| 929.0 | 98.049 |
| 928.0 | 99.681 |
| 927.0 | 94.817 |
| 926.0 | 95.33 |
| 925.0 | 99.358 |
| 924.0 | 98.414 |
| 923.0 | 99.185 |
| 922.0 | 99.063 |
| 921.0 | 95.908 |
| 920.0 | 98.462 |
| 919.0 | 99.254 |
| 918.0 | 98.785 |
| 917.0 | 99.906 |
| 916.0 | 98.284 |
| 915.0 | 95.811 |
| 914.0 | 97.541 |
| 913.0 | 96.999 |
| 912.0 | 95.803 |
| 911.0 | 98.986 |
| 910.0 | 98.789 |
| 909.0 | 99.478 |
| 908.0 | 99.837 |
| 907.0 | 99.283 |
| 906.0 | 98.843 |
| 905.0 | 98.4 |
| 904.0 | 97.271 |
| 903.0 | 99.186 |
| 902.0 | 99.543 |
| 901.0 | 97.485 |
| 900.0 | 93.988 |
| 899.0 | 97.612 |
| 898.0 | 99.703 |
| 897.0 | 98.879 |
| 896.0 | 99.549 |
| 895.0 | 99.938 |
| 894.0 | 97.049 |
| 893.0 | 91.557 |
| 892.0 | 94.51 |
| 891.0 | 98.969 |
| 890.0 | 98.9 |
| 889.0 | 99.73 |
| 888.0 | 99.852 |
| 887.0 | 98.561 |
| 886.0 | 97.589 |
| 885.0 | 96.878 |
| 884.0 | 96.176 |
| 883.0 | 99.052 |
| 882.0 | 99.803 |
| 881.0 | 99.239 |
| 880.0 | 98.478 |
| 879.0 | 97.507 |
| 878.0 | 98.798 |
| 877.0 | 99.591 |
| 876.0 | 98.467 |
| 875.0 | 95.173 |
| 874.0 | 97.219 |
| 873.0 | 98.886 |
| 872.0 | 98.173 |
| 871.0 | 98.898 |
| 870.0 | 99.464 |
| 869.0 | 99.639 |
| 868.0 | 96.067 |
| 867.0 | 94.832 |
| 866.0 | 97.126 |
| 865.0 | 99.052 |
| 864.0 | 99.793 |
| 863.0 | 99.329 |
| 862.0 | 99.173 |
| 861.0 | 99.096 |
| 860.0 | 98.5 |
| 859.0 | 98.682 |
| 858.0 | 98.69 |
| 857.0 | 99.155 |
| 856.0 | 99.374 |
| 855.0 | 99.553 |
| 854.0 | 98.759 |
| 853.0 | 99.334 |
| 852.0 | 99.453 |
| 851.0 | 99.086 |
| 850.0 | 99.635 |
| 849.0 | 99.429 |
| 848.0 | 98.93 |
| 847.0 | 98.705 |
| 846.0 | 98.795 |
| 845.0 | 98.674 |
| 844.0 | 98.979 |
| 843.0 | 98.999 |
| 842.0 | 99.23 |
| 841.0 | 99.576 |
| 840.0 | 98.954 |
| 839.0 | 98.969 |
| 838.0 | 99.281 |
| 837.0 | 98.706 |
| 836.0 | 98.935 |
| 835.0 | 98.895 |
| 834.0 | 98.773 |
| 833.0 | 98.913 |
| 832.0 | 98.763 |
| 831.0 | 98.962 |
| 830.0 | 99.219 |
| 829.0 | 99.115 |
| 828.0 | 98.838 |
| 827.0 | 98.407 |
| 826.0 | 98.306 |
| 825.0 | 98.6 |
| 824.0 | 99.223 |
| 823.0 | 99.885 |
| 822.0 | 99.888 |
| 821.0 | 99.354 |
| 820.0 | 98.255 |
| 819.0 | 97.977 |
| 818.0 | 98.692 |
| 817.0 | 99.148 |
| 816.0 | 99.194 |
| 815.0 | 99.271 |
| 814.0 | 99.574 |
| 813.0 | 98.679 |
| 812.0 | 99.011 |
| 811.0 | 99.615 |
| 810.0 | 99.606 |
| 809.0 | 99.332 |
| 808.0 | 99.313 |
| 807.0 | 99.42 |
| 806.0 | 99.238 |
| 805.0 | 99.029 |
| 804.0 | 99.148 |
| 803.0 | 99.028 |
| 802.0 | 98.917 |
| 801.0 | 99.079 |
| 800.0 | 99.254 |
| 799.0 | 99.078 |
| 798.0 | 99.122 |
| 797.0 | 99.107 |
| 796.0 | 99.039 |
| 795.0 | 99.081 |
| 794.0 | 99.074 |
| 793.0 | 99.022 |
| 792.0 | 99.044 |
| 791.0 | 99.008 |
| 790.0 | 98.966 |
| 789.0 | 99.019 |
| 788.0 | 99.088 |
| 787.0 | 99.09 |
| 786.0 | 99.161 |
| 785.0 | 99.17 |
| 784.0 | 99.09 |
| 783.0 | 99.152 |
| 782.0 | 99.217 |
| 781.0 | 98.878 |
| 780.0 | 96.491 |
| 779.0 | 90.761 |
| 778.0 | 87.205 |
| 777.0 | 87.994 |
| 776.0 | 86.475 |
| 775.0 | 83.895 |
| 774.0 | 80.498 |
| 773.0 | 76.642 |
| 772.0 | 76.636 |
| 771.0 | 76.376 |
| 770.0 | 73.183 |
| 769.0 | 64.672 |
| 768.0 | 59.227 |
| 767.0 | 56.962 |
| 766.0 | 50.236 |
| 765.0 | 50.82 |
| 764.0 | 52.649 |
| 763.0 | 53.084 |
| 762.0 | 52.162 |
| 761.0 | 50.266 |
| 760.0 | 51.377 |
| 759.0 | 50.903 |
| 758.0 | 50.44 |
| 757.0 | 51.834 |
| 756.0 | 48.956 |
| 755.0 | 44.806 |
| 754.0 | 39.768 |
| 753.0 | 34.397 |
| 752.0 | 31.424 |
| 751.0 | 28.974 |
| 750.0 | 25.95 |
| 749.0 | 22.26 |
| 748.0 | 19.916 |
| 747.0 | 18.46 |
| 746.0 | 17.775 |
| 745.0 | 18.007 |
| 744.0 | 18.205 |
| 743.0 | 18.734 |
| 742.0 | 17.151 |
| 741.0 | 13.822 |
| 740.0 | 10.577 |
| 739.0 | 8.717 |
| 738.0 | 8.558 |
| 737.0 | 8.417 |
| 736.0 | 7.313 |
| 735.0 | 6.089 |
| 734.0 | 5.544 |
| 733.0 | 5.184 |
| 732.0 | 3.904 |
| 731.0 | 2.693 |
| 730.0 | 2.819 |
| 729.0 | 3.435 |
| 728.0 | 3.002 |
| 727.0 | 1.812 |
| 726.0 | 1.075 |
| 725.0 | 0.762 |
| 724.0 | 0.498 |
| 723.0 | 0.346 |
| 722.0 | 0.232 |
| 721.0 | 0.11 |
| 720.0 | 0.044 |
| 719.0 | 0.018 |
| 718.0 | 0.006 |
| 717.0 | 0.001 |
| 716.0 | 0.003 |
| 715.0 | 0.004 |
| 714.0 | 0.003 |
| 713.0 | 0.002 |
| 712.0 | 0.006 |
| 711.0 | 0.005 |
| 710.0 | 0.002 |
| 709.0 | 0.005 |
| 708.0 | 0.003 |
| 707.0 | 0.001 |
| 706.0 | 0.006 |
| 705.0 | 0.004 |
| 704.0 | 0.006 |
| 703.0 | 0.003 |
| 702.0 | 0.002 |
| 701.0 | 0.001 |
| 700.0 | 0.005 |
| 699.0 | 0.004 |
| 698.0 | 0.005 |
| 697.0 | 0.004 |
| 696.0 | 0.002 |
| 695.0 | 0.001 |
| 694.0 | 0.006 |
| 693.0 | 0.004 |
| 692.0 | 0.006 |
| 691.0 | 0.005 |
| 690.0 | 0.002 |
| 689.0 | 0.004 |
| 688.0 | 0.005 |
| 687.0 | 0.005 |
| 686.0 | 0.005 |
| 685.0 | 0.003 |
| 684.0 | 0.003 |
| 683.0 | 0.001 |
| 682.0 | 0.007 |
| 681.0 | 0.006 |
| 680.0 | 0.006 |
| 679.0 | 0.004 |
| 678.0 | 0.002 |
| 677.0 | 0.003 |
| 676.0 | 0.006 |
| 675.0 | 0.004 |
| 674.0 | 0.008 |
| 673.0 | 0.005 |
| 672.0 | 0.004 |
| 671.0 | 0.002 |
| 670.0 | 0.007 |
| 669.0 | 0.005 |
| 668.0 | 0.005 |
| 667.0 | 0.003 |
| 666.0 | 0.003 |
| 665.0 | 0.001 |
| 664.0 | 0.007 |
| 663.0 | 0.006 |
| 662.0 | 0.006 |
| 661.0 | 0.006 |
| 660.0 | 0.002 |
| 659.0 | 0.003 |
| 658.0 | 0.007 |
| 657.0 | 0.006 |
| 656.0 | 0.007 |
| 655.0 | 0.006 |
| 654.0 | 0.003 |
| 653.0 | 0.002 |
| 652.0 | 0.005 |
| 651.0 | 0.006 |
| 650.0 | 0.006 |
| 649.0 | 0.006 |
| 648.0 | 0.002 |
| 647.0 | 0.003 |
| 646.0 | 0.005 |
| 645.0 | 0.005 |
| 644.0 | 0.007 |
| 643.0 | 0.007 |
| 642.0 | 0.002 |
| 641.0 | 0.004 |
| 640.0 | 0.006 |
| 639.0 | 0.008 |
| 638.0 | 0.005 |
| 637.0 | 0.005 |
| 636.0 | 0.002 |
| 635.0 | 0.003 |
| 634.0 | 0.005 |
| 633.0 | 0.006 |
| 632.0 | 0.006 |
| 631.0 | 0.006 |
| 630.0 | 0.001 |
| 629.0 | 0.004 |
| 628.0 | 0.005 |
| 627.0 | 0.006 |
| 626.0 | 0.005 |
| 625.0 | 0.007 |
| 624.0 | 0.002 |
| 623.0 | 0.004 |
| 622.0 | 0.006 |
| 621.0 | 0.006 |
| 620.0 | 0.006 |
| 619.0 | 0.007 |
| 618.0 | 0.003 |
| 617.0 | 0.005 |
| 616.0 | 0.006 |
| 615.0 | 0.006 |
| 614.0 | 0.006 |
| 613.0 | 0.005 |
| 612.0 | 0.002 |
| 611.0 | 0.003 |
| 610.0 | 0.006 |
| 609.0 | 0.007 |
| 608.0 | 0.008 |
| 607.0 | 0.006 |
| 606.0 | 0.003 |
| 605.0 | 0.003 |
| 604.0 | 0.006 |
| 603.0 | 0.006 |
| 602.0 | 0.007 |
| 601.0 | 0.006 |
| 600.0 | 0.003 |
| 599.0 | 0.004 |
| 598.0 | 0.006 |
| 597.0 | 0.005 |
| 596.0 | 0.004 |
| 595.0 | 0.006 |
| 594.0 | 0.003 |
| 593.0 | 0.004 |
| 592.0 | 0.006 |
| 591.0 | 0.007 |
| 590.0 | 0.007 |
| 589.0 | 0.006 |
| 588.0 | 0.003 |
| 587.0 | 0.002 |
| 586.0 | 0.006 |
| 585.0 | 0.006 |
| 584.0 | 0.005 |
| 583.0 | 0.006 |
| 582.0 | 0.003 |
| 581.0 | 0.003 |
| 580.0 | 0.006 |
| 579.0 | 0.007 |
| 578.0 | 0.007 |
| 577.0 | 0.005 |
| 576.0 | 0.004 |
| 575.0 | 0.003 |
| 574.0 | 0.008 |
| 573.0 | 0.007 |
| 572.0 | 0.007 |
| 571.0 | 0.005 |
| 570.0 | 0.003 |
| 569.0 | 0.003 |
| 568.0 | 0.006 |
| 567.0 | 0.006 |
| 566.0 | 0.005 |
| 565.0 | 0.006 |
| 564.0 | 0.003 |
| 563.0 | 0.004 |
| 562.0 | 0.007 |
| 561.0 | 0.007 |
| 560.0 | 0.006 |
| 559.0 | 0.005 |
| 558.0 | 0.007 |
| 557.0 | 0.005 |
| 556.0 | 0.003 |
| 555.0 | 0.004 |
| 554.0 | 0.007 |
| 553.0 | 0.005 |
| 552.0 | 0.005 |
| 551.0 | 0.004 |
| 550.0 | 0.003 |
| 549.0 | 0.004 |
| 548.0 | 0.007 |
| 547.0 | 0.007 |
| 546.0 | 0.007 |
| 545.0 | 0.006 |
| 544.0 | 0.004 |
| 543.0 | 0.005 |
| 542.0 | 0.007 |
| 541.0 | 0.006 |
| 540.0 | 0.007 |
| 539.0 | 0.006 |
| 538.0 | 0.003 |
| 537.0 | 0.004 |
| 536.0 | 0.007 |
| 535.0 | 0.007 |
| 534.0 | 0.008 |
| 533.0 | 0.006 |
| 532.0 | 0.003 |
| 531.0 | 0.004 |
| 530.0 | 0.006 |
| 529.0 | 0.007 |
| 528.0 | 0.007 |
| 527.0 | 0.006 |
| 526.0 | 0.003 |
| 525.0 | 0.005 |
| 524.0 | 0.007 |
| 523.0 | 0.007 |
| 522.0 | 0.006 |
| 521.0 | 0.005 |
| 520.0 | 0.003 |
| 519.0 | 0.004 |
| 518.0 | 0.003 |
| 517.0 | 0.005 |
| 516.0 | 0.014 |
| 515.0 | 0.013 |
| 514.0 | 0.01 |
| 513.0 | 0.005 |
| 512.0 | 0.001 |
| 511.0 | 0.003 |
| 510.0 | 0.019 |
| 509.0 | 0.125 |
| 508.0 | 0.436 |
| 507.0 | 0.802 |
| 506.0 | 0.86 |
| 505.0 | 0.611 |
| 504.0 | 0.509 |
| 503.0 | 0.72 |
| 502.0 | 0.846 |
| 501.0 | 0.631 |
| 500.0 | 0.328 |
| 499.0 | 0.207 |
| 498.0 | 0.296 |
| 497.0 | 0.467 |
| 496.0 | 0.53 |
| 495.0 | 0.44 |
| 494.0 | 0.289 |
| 493.0 | 0.163 |
| 492.0 | 0.1 |
| 491.0 | 0.091 |
| 490.0 | 0.145 |
| 489.0 | 0.368 |
| 488.0 | 0.696 |
| 487.0 | 0.795 |
| 486.0 | 0.639 |
| 485.0 | 0.624 |
| 484.0 | 0.803 |
| 483.0 | 0.797 |
| 482.0 | 0.679 |
| 481.0 | 0.858 |
| 480.0 | 1.157 |
| 479.0 | 1.069 |
| 478.0 | 0.718 |
| 477.0 | 0.66 |
| 476.0 | 1.226 |
| 475.0 | 2.294 |
| 474.0 | 3.176 |
| 473.0 | 3.327 |
| 472.0 | 3.33 |
| 471.0 | 4.177 |
| 470.0 | 5.346 |
| 469.0 | 5.006 |
| 468.0 | 3.044 |
| 467.0 | 1.466 |
| 466.0 | 1.292 |
| 465.0 | 1.96 |
| 464.0 | 2.744 |
| 463.0 | 3.054 |
| 462.0 | 2.802 |
| 461.0 | 2.282 |
| 460.0 | 1.69 |
| 459.0 | 1.135 |
| 458.0 | 0.622 |
| 457.0 | 0.253 |
| 456.0 | 0.129 |
| 455.0 | 0.119 |
| 454.0 | 0.09 |
| 453.0 | 0.037 |
| 452.0 | 0.002 |
| 451.0 | 0.006 |
| 450.0 | 0.006 |
| 449.0 | 0.003 |
| 448.0 | 0 |
| 447.0 | 0.003 |
| 446.0 | 0.005 |
| 445.0 | 0.005 |
| 444.0 | 0.006 |
| 443.0 | 0.004 |
| 442.0 | 0.003 |
| 441.0 | 0.006 |
| 440.0 | 0.007 |
| 439.0 | 0.006 |
| 438.0 | 0.007 |
| 437.0 | 0.005 |
| 436.0 | 0.002 |
| 435.0 | 0.005 |
| 434.0 | 0.006 |
| 433.0 | 0.006 |
| 432.0 | 0.007 |
| 431.0 | 0.004 |
| 430.0 | 0.003 |
| 429.0 | 0.004 |
| 428.0 | 0.005 |
| 427.0 | 0.005 |
| 426.0 | 0.005 |
| 425.0 | 0 |
| 424.0 | 0.023 |
| 423.0 | 0.047 |
| 422.0 | 0.037 |
| 421.0 | 0.011 |
| 420.0 | 0.004 |
| 419.0 | 0.015 |
| 418.0 | 0.152 |
| 417.0 | 0.3 |
| 416.0 | 0.251 |
| 415.0 | 0.12 |
| 414.0 | 0.063 |
| 413.0 | 0.063 |
| 412.0 | 0.093 |
| 411.0 | 0.116 |
| 410.0 | 0.078 |
| 409.0 | 0.061 |
| 408.0 | 0.094 |
| 407.0 | 0.092 |
| 406.0 | 0.053 |
| 405.0 | 0.037 |
| 404.0 | 0.043 |
| 403.0 | 0.046 |
| 402.0 | 0.212 |
| 401.0 | 0.498 |
| 400.0 | 0.743 |
| 399.0 | 0.773 |
| 398.0 | 0.509 |
| 397.0 | 0.22 |
| 396.0 | 0.132 |
| 395.0 | 0.127 |
| 394.0 | 0.136 |
| 393.0 | 0.498 |
| 392.0 | 1.005 |
| 391.0 | 0.973 |
| 390.0 | 0.722 |
| 389.0 | 0.716 |
| 388.0 | 0.641 |
| 387.0 | 0.583 |
| 386.0 | 1.261 |
| 385.0 | 2.58 |
| 384.0 | 3.334 |
| 383.0 | 3.127 |
| 382.0 | 2.294 |
| 381.0 | 1.262 |
| 380.0 | 1.248 |
| 379.0 | 2.435 |
| 378.0 | 4.298 |
| 377.0 | 5.565 |
| 376.0 | 4.855 |
| 375.0 | 2.74 |
| 374.0 | 1.163 |
| 373.0 | 0.493 |
| 372.0 | 0.182 |
| 371.0 | 0.043 |
| 370.0 | 0.003 |
| 369.0 | 0.002 |
| 368.0 | 0.003 |
| 367.0 | 0 |
| 366.0 | 0.001 |
| 365.0 | 0.005 |
| 364.0 | 0.004 |
| 363.0 | 0.006 |
| 362.0 | 0.006 |
| 361.0 | 0.003 |
| 360.0 | 0.002 |
| 359.0 | 0.005 |
| 358.0 | 0.006 |
| 357.0 | 0.004 |
| 356.0 | 0.005 |
| 355.0 | 0.003 |
| 354.0 | 0.002 |
| 353.0 | 0.006 |
| 352.0 | 0.007 |
| 351.0 | 0.005 |
| 350.0 | 0.005 |
| 349.0 | 0.003 |
| 348.0 | 0.002 |
| 347.0 | 0.006 |
| 346.0 | 0.006 |
| 345.0 | 0.007 |
| 344.0 | 0.005 |
| 343.0 | 0.004 |
| 342.0 | 0.002 |
| 341.0 | 0.006 |
| 340.0 | 0.007 |
| 339.0 | 0.004 |
| 338.0 | 0.006 |
| 337.0 | 0.004 |
| 336.0 | 0.002 |
| 335.0 | 0.007 |
| 334.0 | 0.006 |
| 333.0 | 0.007 |
| 332.0 | 0.005 |
| 331.0 | 0.002 |
| 330.0 | 0.002 |
| 329.0 | 0.006 |
| 328.0 | 0.007 |
| 327.0 | 0.003 |
| 326.0 | 0.005 |
| 325.0 | 0.003 |
| 324.0 | 0.003 |
| 323.0 | 0.006 |
| 322.0 | 0.007 |
| 321.0 | 0.003 |
| 320.0 | 0.006 |
| 319.0 | 0.002 |
| 318.0 | 0.006 |
| 317.0 | 0.006 |
| 316.0 | 0.004 |
| 315.0 | 0.006 |
| 314.0 | 0.005 |
| 313.0 | 0.002 |
| 312.0 | 0.001 |
| 311.0 | 0.005 |
| 310.0 | 0.006 |
| 309.0 | 0.006 |
| 308.0 | 0.005 |
| 307.0 | 0.002 |
| 306.0 | 0.002 |
| 305.0 | 0.005 |
| 304.0 | 0.005 |
| 303.0 | 0.003 |
| 302.0 | 0.005 |
| 301.0 | 0.003 |
| 300.0 | 0.001 |
| 299.0 | 0.005 |
| 298.0 | 0.006 |
| 297.0 | 0.005 |
| 296.0 | 0.005 |
| 295.0 | 0.003 |
| 294.0 | 0 |
| 293.0 | 0.006 |
| 292.0 | 0.005 |
| 291.0 | 0.003 |
| 290.0 | 0.005 |
| 289.0 | 0.002 |
| 288.0 | 0.001 |
| 287.0 | 0.006 |
| 286.0 | 0.006 |
| 285.0 | 0.008 |
| 284.0 | 0.005 |
| 283.0 | 0.003 |
| 282.0 | 0.001 |
| 281.0 | 0.006 |
| 280.0 | 0.005 |
| 279.0 | 0.006 |
| 278.0 | 0.007 |
| 277.0 | 0.002 |
| 276.0 | 0.001 |
| 275.0 | 0.007 |
| 274.0 | 0.006 |
| 273.0 | 0.006 |
| 272.0 | 0.005 |
| 271.0 | 0.001 |
| 270.0 | 0.002 |
| 269.0 | 0.006 |
| 268.0 | 0.007 |
| 267.0 | 0.003 |
| 266.0 | 0.003 |
| 265.0 | 0.001 |
| 264.0 | 0.002 |
| 263.0 | 0.006 |
| 262.0 | 0.007 |
| 261.0 | 0.004 |
| 260.0 | 0.007 |
| 259.0 | 0.002 |
| 258.0 | 0.003 |
| 257.0 | 0.006 |
| 256.0 | 0.007 |
| 255.0 | 0.004 |
| 254.0 | 0.007 |
| 253.0 | 0.001 |
| 252.0 | 0.003 |
| 251.0 | 0.005 |
| 250.0 | 0.007 |
| 249.0 | 0.003 |
| 248.0 | 0.008 |
| 247.0 | 0.002 |
| 246.0 | 0.002 |
| 245.0 | 0.006 |
| 244.0 | 0.006 |
| 243.0 | 0.006 |
| 242.0 | 0.007 |
| 241.0 | 0.001 |
| 240.0 | 0.004 |
| 239.0 | 0.006 |
| 238.0 | 0.009 |
| 237.0 | 0.003 |
| 236.0 | 0.008 |
| 235.0 | 0.002 |
| 234.0 | 0.003 |
| 233.0 | 0.007 |
| 232.0 | 0.007 |
| 231.0 | 0.004 |
| 230.0 | 0.007 |
| 229.0 | 0.001 |
| 228.0 | 0.003 |
| 227.0 | 0.007 |
| 226.0 | 0.007 |
| 225.0 | 0.007 |
| 224.0 | 0.006 |
| 223.0 | 0.002 |
| 222.0 | 0.004 |
| 221.0 | 0.007 |
| 220.0 | 0.008 |
| 219.0 | 0.005 |
| 218.0 | 0.006 |
| 217.0 | 0.003 |
| 216.0 | 0.004 |
| 215.0 | 0.008 |
| 214.0 | 0.008 |
| 213.0 | 0.009 |
| 212.0 | 0.007 |
| 211.0 | 0.005 |
| 210.0 | 0.005 |
| 209.0 | 0.008 |
| 208.0 | 0.008 |
| 207.0 | 0.006 |
| 206.0 | 0.008 |
| 205.0 | 0.006 |
| 204.0 | 0.006 |
| 203.0 | 0.012 |
| 202.0 | 0.012 |
| 201.0 | 0.015 |